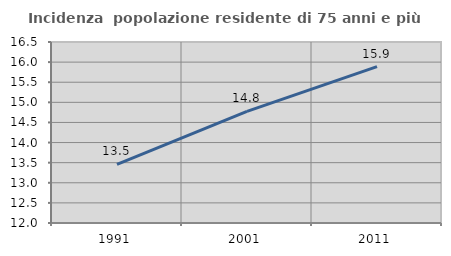
| Category | Incidenza  popolazione residente di 75 anni e più |
|---|---|
| 1991.0 | 13.46 |
| 2001.0 | 14.776 |
| 2011.0 | 15.886 |